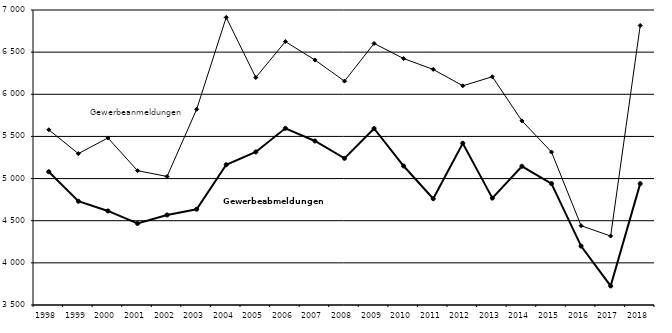
| Category | Gewerbeanmeldungen | Gewerbeabmeldungen |
|---|---|---|
| 1998.0 | 5579 | 5081 |
| 1999.0 | 5296 | 4731 |
| 2000.0 | 5482 | 4616 |
| 2001.0 | 5094 | 4467 |
| 2002.0 | 5025 | 4568 |
| 2003.0 | 5822 | 4636 |
| 2004.0 | 6912 | 5164 |
| 2005.0 | 6199 | 5316 |
| 2006.0 | 6625 | 5596 |
| 2007.0 | 6407 | 5446 |
| 2008.0 | 6156 | 5240 |
| 2009.0 | 6603 | 5594 |
| 2010.0 | 6424 | 5149 |
| 2011.0 | 6295 | 4761 |
| 2012.0 | 6101 | 5419 |
| 2013.0 | 6208 | 4768 |
| 2014.0 | 5685 | 5146 |
| 2015.0 | 5315 | 4940 |
| 2016.0 | 4441 | 4199 |
| 2017.0 | 4318 | 3726 |
| 2018.0 | 6816 | 4940 |